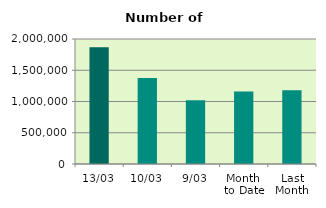
| Category | Series 0 |
|---|---|
| 13/03 | 1867794 |
| 10/03 | 1375630 |
| 9/03 | 1019920 |
| Month 
to Date | 1159552.889 |
| Last
Month | 1180310.4 |